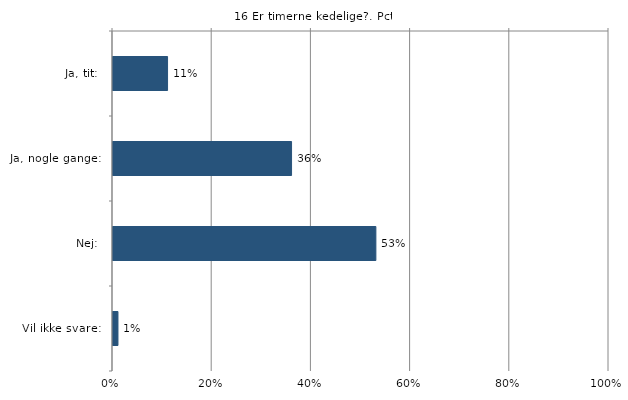
| Category | Er timerne kedelige? |
|---|---|
| Ja, tit:  | 0.11 |
| Ja, nogle gange:  | 0.36 |
| Nej:  | 0.53 |
| Vil ikke svare:  | 0.01 |